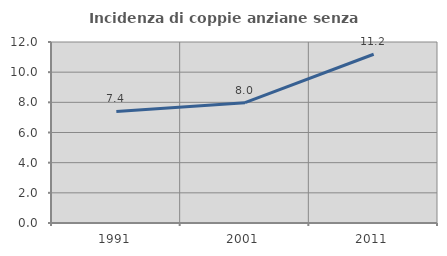
| Category | Incidenza di coppie anziane senza figli  |
|---|---|
| 1991.0 | 7.395 |
| 2001.0 | 7.98 |
| 2011.0 | 11.187 |